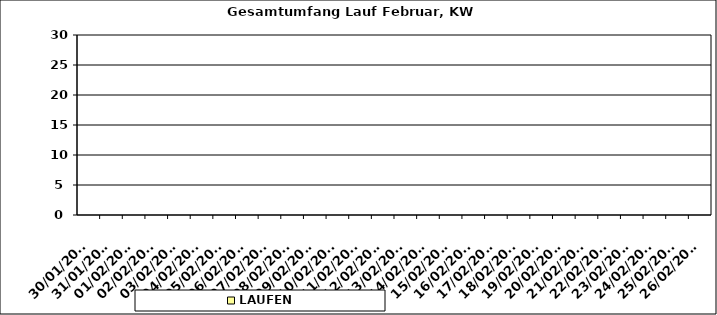
| Category | LAUFEN |
|---|---|
| 30/01/2023 | 0 |
| 31/01/2023 | 0 |
| 01/02/2023 | 0 |
| 02/02/2023 | 0 |
| 03/02/2023 | 0 |
| 04/02/2023 | 0 |
| 05/02/2023 | 0 |
| 06/02/2023 | 0 |
| 07/02/2023 | 0 |
| 08/02/2023 | 0 |
| 09/02/2023 | 0 |
| 10/02/2023 | 0 |
| 11/02/2023 | 0 |
| 12/02/2023 | 0 |
| 13/02/2023 | 0 |
| 14/02/2023 | 0 |
| 15/02/2023 | 0 |
| 16/02/2023 | 0 |
| 17/02/2023 | 0 |
| 18/02/2023 | 0 |
| 19/02/2023 | 0 |
| 20/02/2023 | 0 |
| 21/02/2023 | 0 |
| 22/02/2023 | 0 |
| 23/02/2023 | 0 |
| 24/02/2023 | 0 |
| 25/02/2023 | 0 |
| 26/02/2023 | 0 |